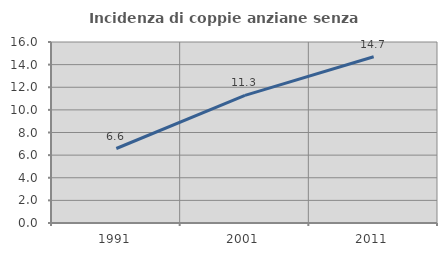
| Category | Incidenza di coppie anziane senza figli  |
|---|---|
| 1991.0 | 6.585 |
| 2001.0 | 11.277 |
| 2011.0 | 14.7 |